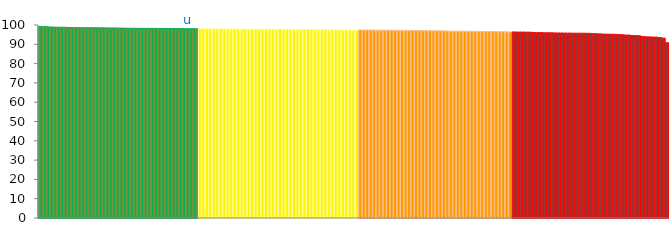
| Category | Top Quartile | 2nd Quartile | 3rd Quartile | Bottom Quartile | Series 4 |
|---|---|---|---|---|---|
|  | 99.24 | 0 | 0 | 0 | 99.24 |
|  | 99.15 | 0 | 0 | 0 | 99.15 |
|  | 99.14 | 0 | 0 | 0 | 99.14 |
|  | 99.01 | 0 | 0 | 0 | 99.01 |
|  | 98.96 | 0 | 0 | 0 | 98.96 |
|  | 98.87 | 0 | 0 | 0 | 98.87 |
|  | 98.85 | 0 | 0 | 0 | 98.85 |
|  | 98.85 | 0 | 0 | 0 | 98.85 |
|  | 98.74 | 0 | 0 | 0 | 98.74 |
|  | 98.69 | 0 | 0 | 0 | 98.69 |
|  | 98.67 | 0 | 0 | 0 | 98.67 |
|  | 98.64 | 0 | 0 | 0 | 98.64 |
|  | 98.63 | 0 | 0 | 0 | 98.63 |
|  | 98.6 | 0 | 0 | 0 | 98.6 |
|  | 98.6 | 0 | 0 | 0 | 98.6 |
|  | 98.6 | 0 | 0 | 0 | 98.6 |
|  | 98.57 | 0 | 0 | 0 | 98.57 |
|  | 98.56 | 0 | 0 | 0 | 98.56 |
|  | 98.55 | 0 | 0 | 0 | 98.55 |
|  | 98.52 | 0 | 0 | 0 | 98.52 |
|  | 98.5 | 0 | 0 | 0 | 98.5 |
|  | 98.48 | 0 | 0 | 0 | 98.48 |
|  | 98.47 | 0 | 0 | 0 | 98.47 |
|  | 98.43 | 0 | 0 | 0 | 98.43 |
|  | 98.39 | 0 | 0 | 0 | 98.39 |
|  | 98.34 | 0 | 0 | 0 | 98.34 |
|  | 98.33 | 0 | 0 | 0 | 98.33 |
|  | 98.33 | 0 | 0 | 0 | 98.33 |
|  | 98.3 | 0 | 0 | 0 | 98.3 |
|  | 98.28 | 0 | 0 | 0 | 98.28 |
|  | 98.28 | 0 | 0 | 0 | 98.28 |
|  | 98.28 | 0 | 0 | 0 | 98.28 |
|  | 98.27 | 0 | 0 | 0 | 98.27 |
|  | 98.27 | 0 | 0 | 0 | 98.27 |
|  | 98.23 | 0 | 0 | 0 | 98.23 |
|  | 98.22 | 0 | 0 | 0 | 98.22 |
|  | 98.2 | 0 | 0 | 0 | 98.2 |
|  | 98.2 | 0 | 0 | 0 | 98.2 |
|  | 98.2 | 0 | 0 | 0 | 98.2 |
|  | 98.19 | 0 | 0 | 0 | 98.19 |
|  | 98.19 | 0 | 0 | 0 | 98.19 |
|  | 98.16 | 0 | 0 | 0 | 98.16 |
|  | 98.14 | 0 | 0 | 0 | 98.14 |
| u | 98.11 | 0 | 0 | 0 | 98.11 |